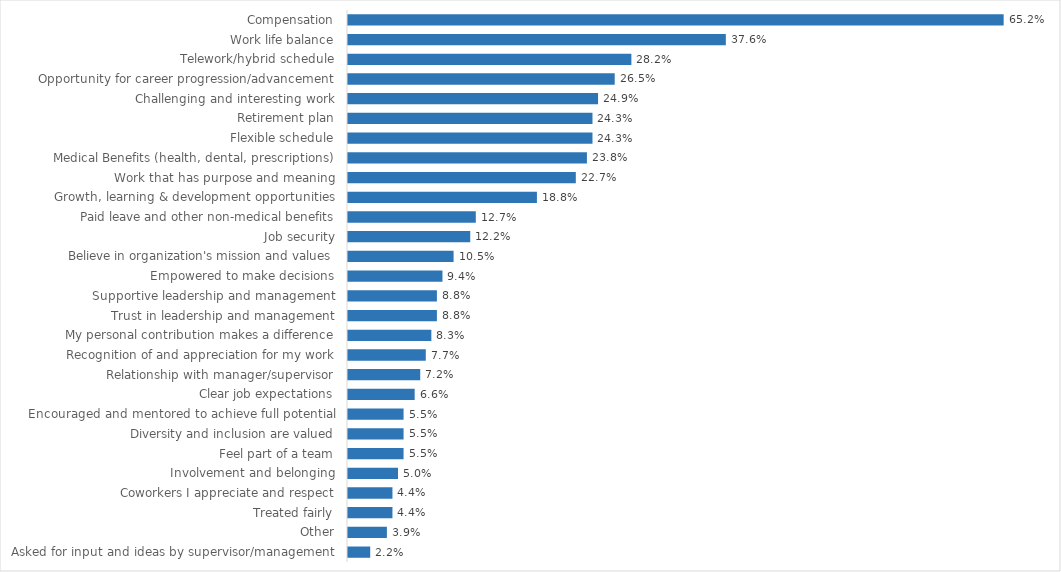
| Category | Environmental Conservation |
|---|---|
| Compensation | 0.652 |
| Work life balance | 0.376 |
| Telework/hybrid schedule | 0.282 |
| Opportunity for career progression/advancement | 0.265 |
| Challenging and interesting work | 0.249 |
| Retirement plan | 0.243 |
| Flexible schedule | 0.243 |
| Medical Benefits (health, dental, prescriptions) | 0.238 |
| Work that has purpose and meaning | 0.227 |
| Growth, learning & development opportunities | 0.188 |
| Paid leave and other non-medical benefits | 0.127 |
| Job security | 0.122 |
| Believe in organization's mission and values | 0.105 |
| Empowered to make decisions | 0.094 |
| Supportive leadership and management | 0.088 |
| Trust in leadership and management | 0.088 |
| My personal contribution makes a difference | 0.083 |
| Recognition of and appreciation for my work | 0.077 |
| Relationship with manager/supervisor | 0.072 |
| Clear job expectations | 0.066 |
| Encouraged and mentored to achieve full potential | 0.055 |
| Diversity and inclusion are valued | 0.055 |
| Feel part of a team | 0.055 |
| Involvement and belonging | 0.05 |
| Coworkers I appreciate and respect | 0.044 |
| Treated fairly | 0.044 |
| Other | 0.039 |
| Asked for input and ideas by supervisor/management | 0.022 |